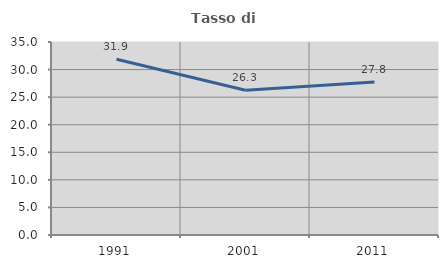
| Category | Tasso di occupazione   |
|---|---|
| 1991.0 | 31.877 |
| 2001.0 | 26.263 |
| 2011.0 | 27.759 |